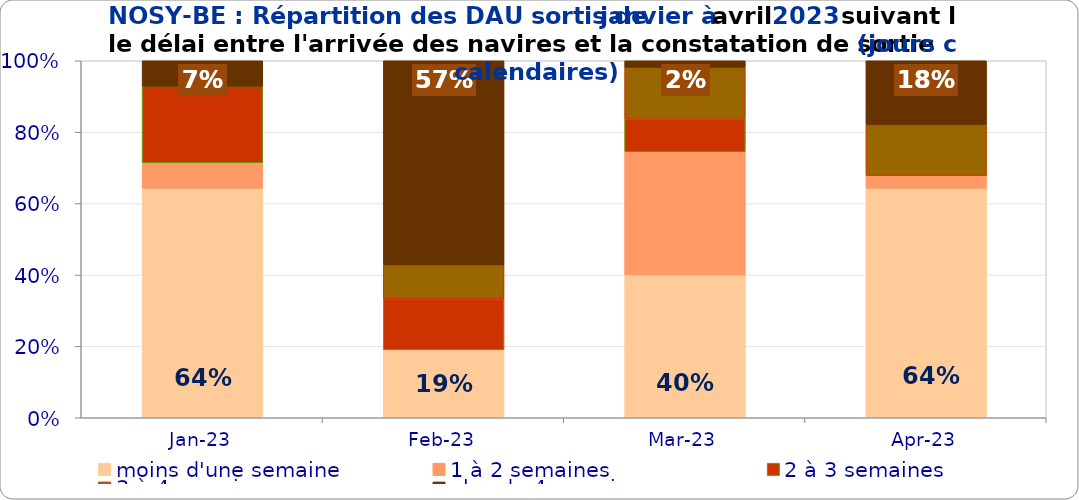
| Category | moins d'une semaine | 1 à 2 semaines | 2 à 3 semaines | 3 à 4 semaines | plus de 4 semaines |
|---|---|---|---|---|---|
| 2023-01-01 | 0.643 | 0.071 | 0.214 | 0 | 0.071 |
| 2023-02-01 | 0.19 | 0 | 0.143 | 0.095 | 0.571 |
| 2023-03-01 | 0.4 | 0.345 | 0.091 | 0.145 | 0.018 |
| 2023-04-01 | 0.643 | 0.036 | 0 | 0.143 | 0.179 |